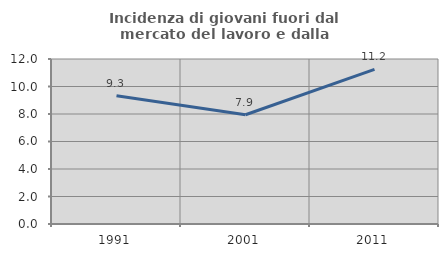
| Category | Incidenza di giovani fuori dal mercato del lavoro e dalla formazione  |
|---|---|
| 1991.0 | 9.335 |
| 2001.0 | 7.947 |
| 2011.0 | 11.248 |